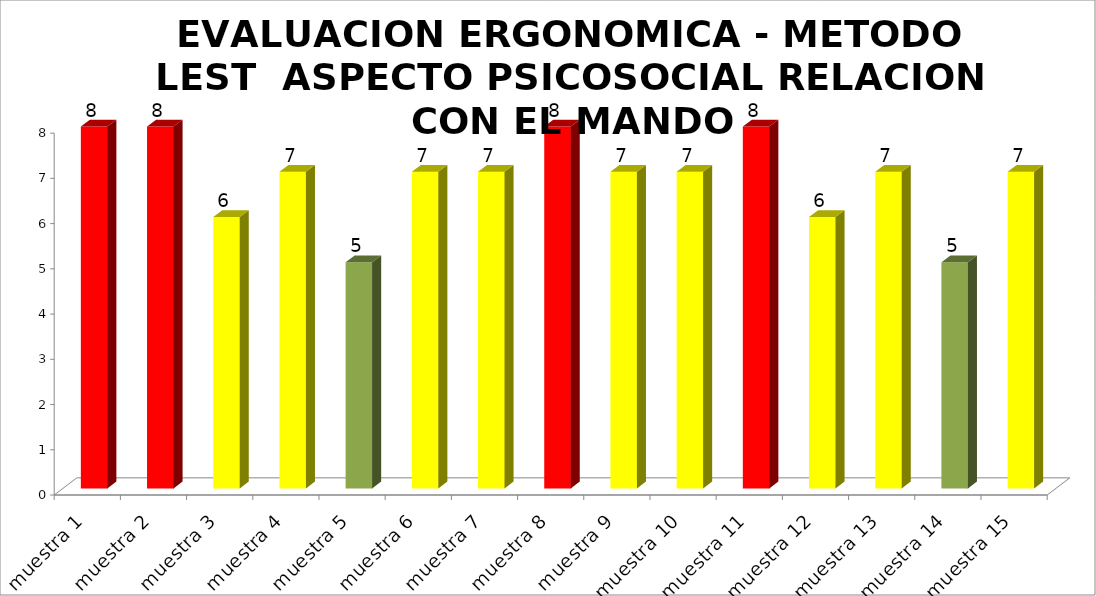
| Category | EVALUACION ERGONOMICA - METODO LEST  |
|---|---|
| muestra 1 | 8 |
| muestra 2 | 8 |
| muestra 3 | 6 |
| muestra 4 | 7 |
| muestra 5 | 5 |
| muestra 6 | 7 |
| muestra 7 | 7 |
| muestra 8 | 8 |
| muestra 9 | 7 |
| muestra 10 | 7 |
| muestra 11 | 8 |
| muestra 12 | 6 |
| muestra 13 | 7 |
| muestra 14 | 5 |
| muestra 15 | 7 |